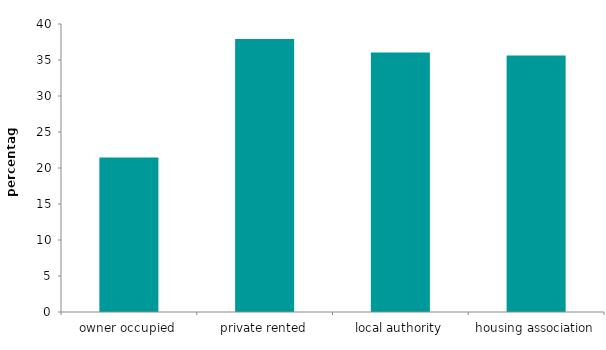
| Category | Series 1 |
|---|---|
| owner occupied | 21.458 |
| private rented | 37.904 |
| local authority | 36.047 |
| housing association | 35.628 |